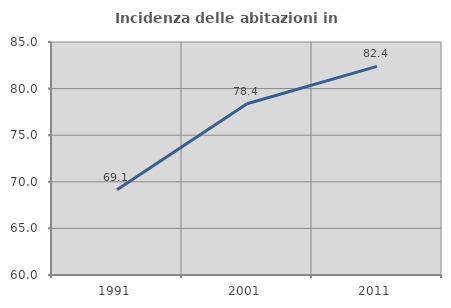
| Category | Incidenza delle abitazioni in proprietà  |
|---|---|
| 1991.0 | 69.147 |
| 2001.0 | 78.375 |
| 2011.0 | 82.384 |